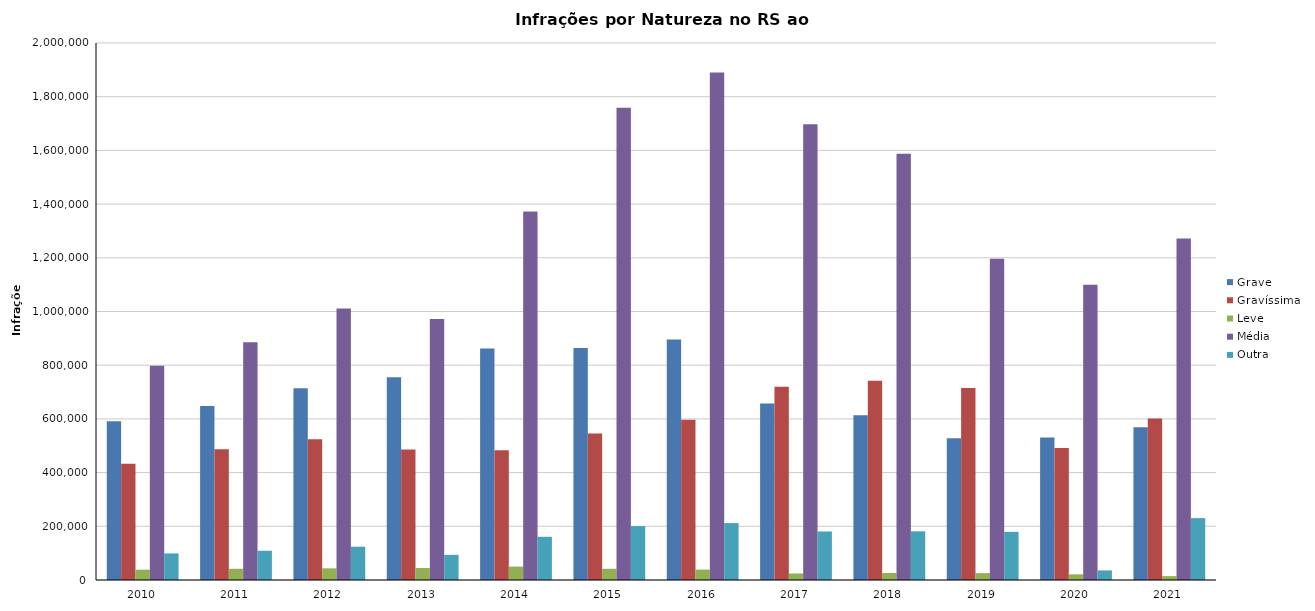
| Category | Grave | Gravíssima | Leve | Média | Outra |
|---|---|---|---|---|---|
| 2010 | 590798 | 433399 | 38373 | 798231 | 98896 |
| 2011 | 648368 | 487254 | 41788 | 885755 | 108898 |
| 2012 | 714438 | 524207 | 43448 | 1011596 | 124027 |
| 2013 | 755409 | 486240 | 44656 | 971828 | 93610 |
| 2014 | 862019 | 483200 | 49951 | 1372622 | 160878 |
| 2015 | 863660 | 545379 | 41743 | 1758478 | 200819 |
| 2016 | 895631 | 597003 | 38727 | 1889941 | 211874 |
| 2017 | 657113 | 719309 | 24268 | 1697210 | 180809 |
| 2018 | 614000 | 742093 | 26002 | 1587104 | 181321 |
| 2019 | 527979 | 715297 | 25645 | 1196531 | 179246 |
| 2020 | 531166 | 491437 | 21034 | 1099930 | 35710 |
| 2021 | 568559 | 601060 | 14358 | 1271460 | 230386 |